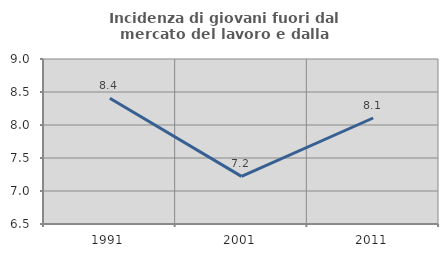
| Category | Incidenza di giovani fuori dal mercato del lavoro e dalla formazione  |
|---|---|
| 1991.0 | 8.406 |
| 2001.0 | 7.221 |
| 2011.0 | 8.106 |